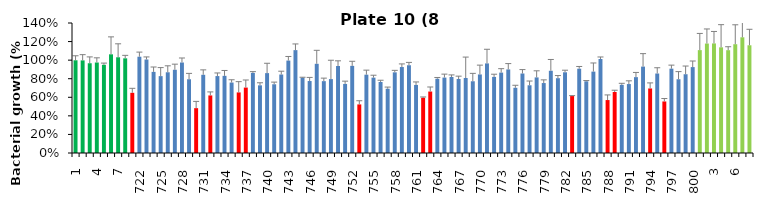
| Category | 8 h % |
|---|---|
| 1.0 | 0.998 |
| 2.0 | 0.997 |
| 3.0 | 0.967 |
| 4.0 | 0.974 |
| 5.0 | 0.95 |
| 6.0 | 1.063 |
| 7.0 | 1.031 |
| 8.0 | 1.02 |
| 721.0 | 0.648 |
| 722.0 | 1.037 |
| 723.0 | 1.007 |
| 724.0 | 0.874 |
| 725.0 | 0.828 |
| 726.0 | 0.869 |
| 727.0 | 0.896 |
| 728.0 | 0.974 |
| 729.0 | 0.794 |
| 730.0 | 0.483 |
| 731.0 | 0.842 |
| 732.0 | 0.62 |
| 733.0 | 0.828 |
| 734.0 | 0.831 |
| 735.0 | 0.759 |
| 736.0 | 0.652 |
| 737.0 | 0.705 |
| 738.0 | 0.863 |
| 739.0 | 0.729 |
| 740.0 | 0.86 |
| 741.0 | 0.74 |
| 742.0 | 0.845 |
| 743.0 | 0.995 |
| 744.0 | 1.108 |
| 745.0 | 0.811 |
| 746.0 | 0.775 |
| 747.0 | 0.961 |
| 748.0 | 0.774 |
| 749.0 | 0.796 |
| 750.0 | 0.937 |
| 751.0 | 0.744 |
| 752.0 | 0.938 |
| 753.0 | 0.523 |
| 754.0 | 0.843 |
| 755.0 | 0.812 |
| 756.0 | 0.765 |
| 757.0 | 0.692 |
| 758.0 | 0.869 |
| 759.0 | 0.926 |
| 760.0 | 0.945 |
| 761.0 | 0.733 |
| 762.0 | 0.595 |
| 763.0 | 0.662 |
| 764.0 | 0.8 |
| 765.0 | 0.812 |
| 766.0 | 0.819 |
| 767.0 | 0.797 |
| 768.0 | 0.807 |
| 769.0 | 0.773 |
| 770.0 | 0.846 |
| 771.0 | 0.965 |
| 772.0 | 0.819 |
| 773.0 | 0.866 |
| 774.0 | 0.9 |
| 775.0 | 0.702 |
| 776.0 | 0.856 |
| 777.0 | 0.729 |
| 778.0 | 0.814 |
| 779.0 | 0.753 |
| 780.0 | 0.886 |
| 781.0 | 0.806 |
| 782.0 | 0.869 |
| 783.0 | 0.613 |
| 784.0 | 0.908 |
| 785.0 | 0.772 |
| 786.0 | 0.877 |
| 787.0 | 1.012 |
| 788.0 | 0.57 |
| 789.0 | 0.657 |
| 790.0 | 0.734 |
| 791.0 | 0.743 |
| 792.0 | 0.817 |
| 793.0 | 0.931 |
| 794.0 | 0.695 |
| 795.0 | 0.856 |
| 796.0 | 0.555 |
| 797.0 | 0.908 |
| 798.0 | 0.794 |
| 799.0 | 0.848 |
| 800.0 | 0.925 |
| 1.0 | 1.108 |
| 2.0 | 1.179 |
| 3.0 | 1.18 |
| 4.0 | 1.138 |
| 5.0 | 1.107 |
| 6.0 | 1.172 |
| 7.0 | 1.246 |
| 8.0 | 1.16 |